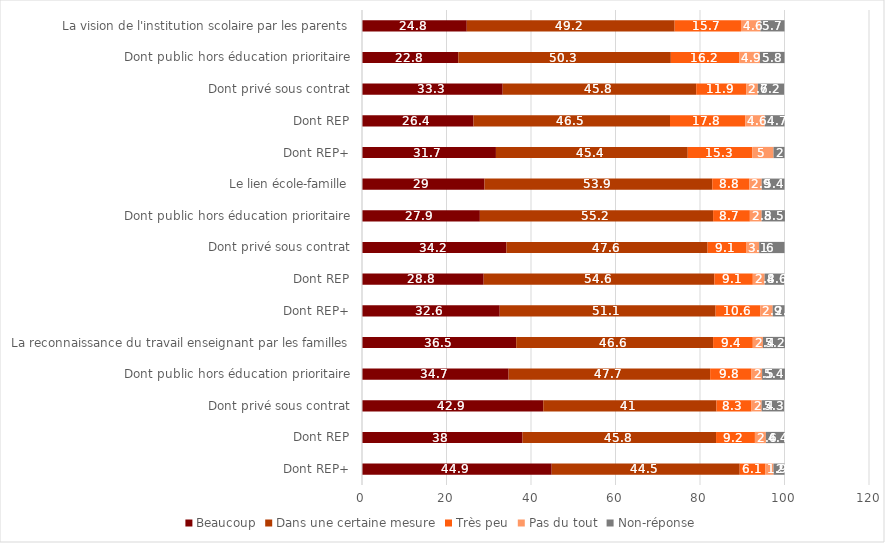
| Category | Beaucoup | Dans une certaine mesure | Très peu | Pas du tout | Non-réponse |
|---|---|---|---|---|---|
| Dont REP+ | 44.9 | 44.5 | 6.1 | 1.9 | 2.6 |
| Dont REP | 38 | 45.8 | 9.2 | 2.6 | 4.4 |
| Dont privé sous contrat | 42.9 | 41 | 8.3 | 2.4 | 5.3 |
| Dont public hors éducation prioritaire | 34.7 | 47.7 | 9.8 | 2.5 | 5.4 |
| La reconnaissance du travail enseignant par les familles | 36.5 | 46.6 | 9.4 | 2.4 | 5.2 |
| Dont REP+ | 32.6 | 51.1 | 10.6 | 2.9 | 2.8 |
| Dont REP | 28.8 | 54.6 | 9.1 | 2.8 | 4.6 |
| Dont privé sous contrat | 34.2 | 47.6 | 9.1 | 3.1 | 6 |
| Dont public hors éducation prioritaire | 27.9 | 55.2 | 8.7 | 2.8 | 5.5 |
| Le lien école-famille | 29 | 53.9 | 8.8 | 2.9 | 5.4 |
| Dont REP+ | 31.7 | 45.4 | 15.3 | 5 | 2.6 |
| Dont REP | 26.4 | 46.5 | 17.8 | 4.6 | 4.7 |
| Dont privé sous contrat | 33.3 | 45.8 | 11.9 | 2.7 | 6.2 |
| Dont public hors éducation prioritaire | 22.8 | 50.3 | 16.2 | 4.9 | 5.8 |
| La vision de l'institution scolaire par les parents | 24.8 | 49.2 | 15.7 | 4.6 | 5.7 |